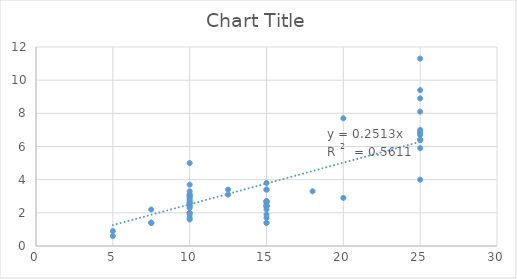
| Category | Series 0 |
|---|---|
| 10.0 | 3.7 |
| 10.0 | 2.3 |
| 10.0 | 3.1 |
| 15.0 | 2.4 |
| 10.0 | 2.8 |
| 25.0 | 8.9 |
| 5.0 | 0.9 |
| 25.0 | 11.3 |
| 25.0 | 9.4 |
| 15.0 | 3.8 |
| 10.0 | 1.6 |
| 10.0 | 2.5 |
| 10.0 | 2.6 |
| 10.0 | 2.9 |
| 15.0 | 1.7 |
| 15.0 | 1.4 |
| 10.0 | 2 |
| 15.0 | 1.9 |
| 15.0 | 2.4 |
| 10.0 | 1.7 |
| 10.0 | 2 |
| 12.5 | 3.4 |
| 10.0 | 3.1 |
| 10.0 | 5 |
| 7.5 | 2.2 |
| 18.0 | 3.3 |
| 20.0 | 7.7 |
| 25.0 | 6.4 |
| 25.0 | 6.8 |
| 25.0 | 6.7 |
| 25.0 | 8.1 |
| 25.0 | 6.4 |
| 25.0 | 7 |
| 25.0 | 6.9 |
| 25.0 | 6.4 |
| 12.5 | 3.1 |
| 15.0 | 3.4 |
| 15.0 | 1.4 |
| 7.5 | 1.4 |
| 10.0 | 3.3 |
| 5.0 | 0.6 |
| 7.5 | 1.4 |
| 15.0 | 2.6 |
| 15.0 | 2.7 |
| 15.0 | 2.7 |
| 20.0 | 2.9 |
| 15.0 | 2.7 |
| 15.0 | 2.2 |
| 15.0 | 2.4 |
| 15.0 | 2.4 |
| 15.0 | 2.5 |
| 7.5 | 1.4 |
| 10.0 | 1.9 |
| 15.0 | 3.4 |
| 25.0 | 4 |
| 25.0 | 5.9 |
| 10.0 | 2.6 |
| 10.0 | 2.4 |
| 10.0 | 3 |
| 10.0 | 2.7 |
| 10.0 | 3 |